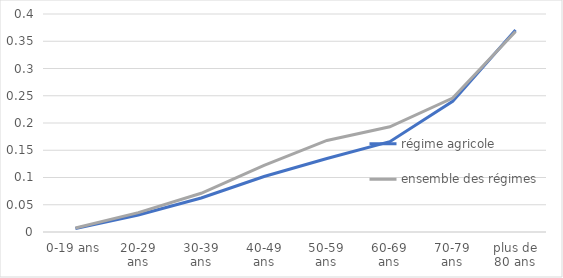
| Category | régime agricole | ensemble des régimes |
|---|---|---|
| 0-19 ans | 0.006 | 0.007 |
| 20-29 ans | 0.031 | 0.036 |
| 30-39 ans | 0.062 | 0.071 |
| 40-49 ans | 0.102 | 0.122 |
| 50-59 ans | 0.135 | 0.168 |
| 60-69 ans | 0.166 | 0.193 |
| 70-79 ans | 0.24 | 0.246 |
| plus de 80 ans | 0.37 | 0.368 |